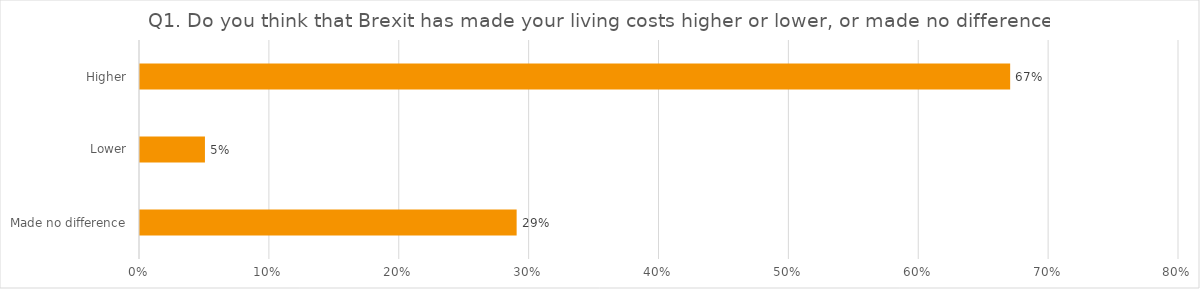
| Category | Q1. Do you think that Brexit has made your living costs higher or lower, or made no difference? |
|---|---|
| Made no difference | 0.29 |
| Lower | 0.05 |
| Higher | 0.67 |